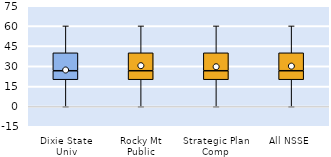
| Category | 25th | 50th | 75th |
|---|---|---|---|
| Dixie State Univ | 20 | 6.667 | 13.333 |
| Rocky Mt Public | 20 | 6.667 | 13.333 |
| Strategic Plan Comp | 20 | 6.667 | 13.333 |
| All NSSE | 20 | 6.667 | 13.333 |